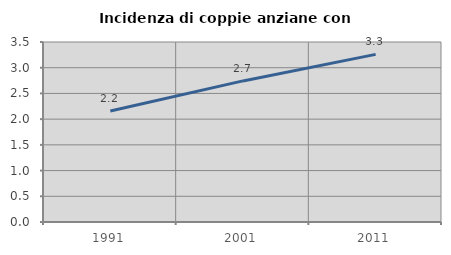
| Category | Incidenza di coppie anziane con figli |
|---|---|
| 1991.0 | 2.158 |
| 2001.0 | 2.743 |
| 2011.0 | 3.259 |